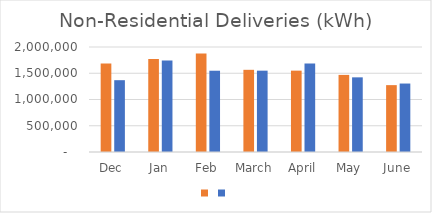
| Category | Series 1 | Series 0 |
|---|---|---|
| Dec | 1688051 | 1367905 |
| Jan | 1770828 | 1741151 |
| Feb | 1874770 | 1548063 |
| March | 1565360 | 1549153 |
| April | 1549578 | 1684688 |
| May | 1468470 | 1421957 |
| June | 1273660 | 1304116 |